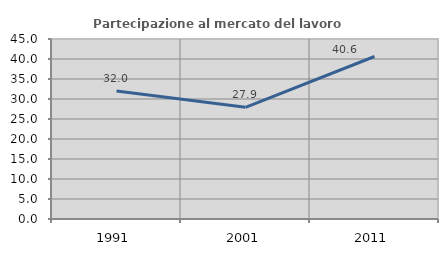
| Category | Partecipazione al mercato del lavoro  femminile |
|---|---|
| 1991.0 | 32 |
| 2001.0 | 27.928 |
| 2011.0 | 40.625 |